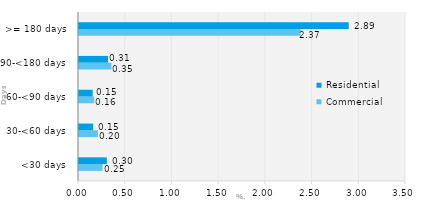
| Category | Commercial | Residential |
|---|---|---|
| <30 days | 0.253 | 0.298 |
| 30-<60 days | 0.203 | 0.152 |
| 60-<90 days | 0.163 | 0.147 |
| 90-<180 days | 0.347 | 0.311 |
| >= 180 days | 2.372 | 2.887 |